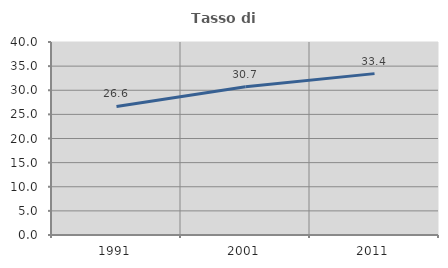
| Category | Tasso di occupazione   |
|---|---|
| 1991.0 | 26.636 |
| 2001.0 | 30.704 |
| 2011.0 | 33.446 |